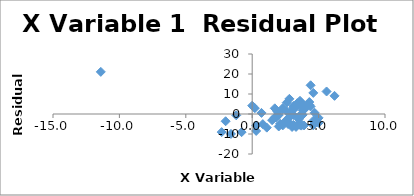
| Category | Series 0 |
|---|---|
| 4.6 | -5.67 |
| 4.6 | -3.377 |
| 5.0 | -1.943 |
| 4.7 | 0.597 |
| 4.4 | 3.755 |
| 3.6 | 6.586 |
| 4.6 | 10.539 |
| 4.4 | 14.352 |
| 5.6 | 11.261 |
| 6.2 | 9.074 |
| 4.3 | 5.976 |
| 3.1 | 4.046 |
| 2.6 | 5.682 |
| 3.5 | 4.802 |
| 3.7 | 5.27 |
| 2.8 | 7.572 |
| 3.3 | 3.436 |
| 2.3 | 2.932 |
| 2.3 | 2.312 |
| 3.7 | -0.318 |
| 3.1 | 3.253 |
| 3.7 | 4.292 |
| 3.8 | 1.835 |
| 3.1 | -0.485 |
| 1.5 | -3.106 |
| 0.3 | -8.473 |
| -0.8 | -9.09 |
| -1.6 | -9.969 |
| -2.3 | -9.062 |
| -2.0 | -3.625 |
| -1.2 | -0.659 |
| 0.7 | 0.541 |
| 2.0 | -0.511 |
| 2.8 | -4.572 |
| 2.0 | -6.243 |
| 0.3 | -5.7 |
| 1.1 | -6.816 |
| 0.8 | -5.055 |
| 2.1 | -4.88 |
| 3.3 | -6.483 |
| 2.8 | -4.805 |
| 2.5 | -3.519 |
| 1.7 | -1.714 |
| 2.8 | -1.552 |
| 1.9 | 1.197 |
| 2.6 | 1.27 |
| 3.0 | 1.826 |
| 1.7 | 2.837 |
| 3.5 | -1.313 |
| 2.8 | -1.662 |
| 3.6 | -4.465 |
| 5.0 | -4.436 |
| 3.8 | -0.44 |
| 3.9 | 2.127 |
| 3.7 | 5.622 |
| 3.2 | 3.65 |
| 4.0 | 3.031 |
| 4.3 | 4.644 |
| 4.1 | 4.061 |
| 3.4 | 5.396 |
| 3.2 | 3.327 |
| 3.5 | -2.59 |
| 3.5 | -5.267 |
| 3.9 | -5.717 |
| 3.6 | -5.474 |
| 3.7 | -5.804 |
| 3.1 | -5.44 |
| 3.3 | -5.991 |
| 3.0 | -6.484 |
| 2.3 | -5.709 |
| 2.7 | -5.022 |
| 1.8 | -1.808 |
| 0.0 | 4.165 |
| -11.4 | 21.069 |
| 0.2 | 2.915 |